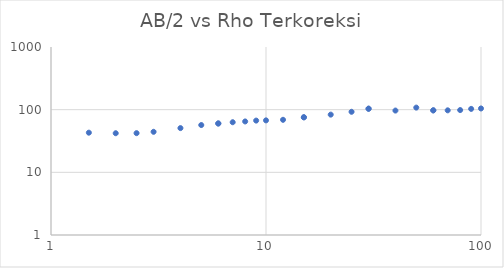
| Category | Series 0 |
|---|---|
| 1.5 | 42.936 |
| 2.0 | 42.079 |
| 2.5 | 42.19 |
| 3.0 | 44.33 |
| 4.0 | 50.787 |
| 5.0 | 56.826 |
| 6.0 | 60.214 |
| 6.0 | 60.214 |
| 7.0 | 63.039 |
| 8.0 | 64.843 |
| 9.0 | 66.921 |
| 10.0 | 67.472 |
| 12.0 | 68.907 |
| 15.0 | 75.554 |
| 15.0 | 75.554 |
| 20.0 | 83.341 |
| 25.0 | 92.485 |
| 30.0 | 103.625 |
| 30.0 | 103.625 |
| 40.0 | 96.767 |
| 50.0 | 107.87 |
| 60.0 | 97.495 |
| 60.0 | 97.495 |
| 70.0 | 97.569 |
| 80.0 | 98.534 |
| 90.0 | 102.914 |
| 100.0 | 104.516 |